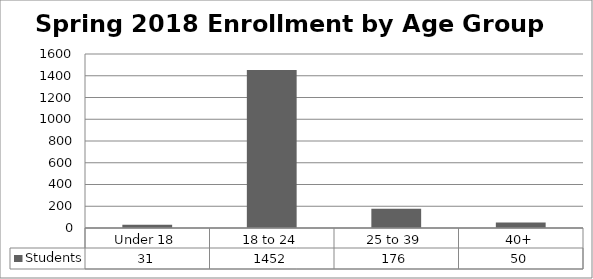
| Category | Students |
|---|---|
| Under 18 | 31 |
| 18 to 24 | 1452 |
| 25 to 39 | 176 |
| 40+ | 50 |